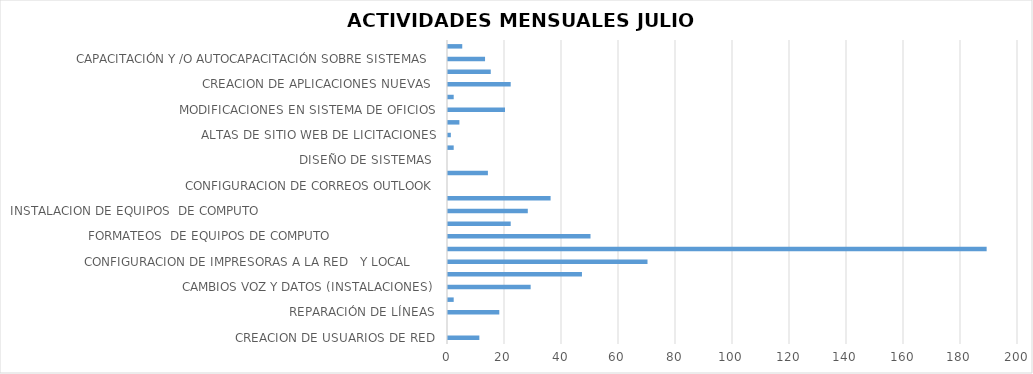
| Category | Series 0 |
|---|---|
| CREACION DE USUARIOS DE RED | 11 |
| CREACION DE CLAVES PARA LLAMADAS A CELULAR  | 0 |
| REPARACIÓN DE LÍNEAS | 18 |
| DICTAMENES DE EQUIPOS (TELEFONOS Y FAXES) | 2 |
| CAMBIOS VOZ Y DATOS (INSTALACIONES) | 29 |
| DICTAMENES DE EQUIPOS DE COMPUTO                             | 47 |
| CONFIGURACION DE IMPRESORAS A LA RED   Y LOCAL       | 70 |
| REVISION DE EQUIPOS DE COMPUTO             | 189 |
| FORMATEOS  DE EQUIPOS DE COMPUTO                            | 50 |
| MANTENIMIENTO DE EQUIPOS  DE COMPUTO               | 22 |
| INSTALACION DE EQUIPOS  DE COMPUTO                                               | 28 |
| INSTALACION DE SOFTWARE EN EQUIPOS DE COMPUTO | 36 |
| CONFIGURACION DE CORREOS OUTLOOK | 0 |
| REPARACIÓN DE EQUIPOS DE CÓMPUTO | 14 |
| DISEÑO DE SISTEMAS  | 0 |
| CREACIÓN DE USUARIOS DE OFICIOS Y CORREOS ELECTRONICOS | 2 |
| ALTAS DE SITIO WEB DE LICITACIONES | 1 |
| SISTEMA EN DESARROLLO | 4 |
| MODIFICACIONES EN SISTEMA DE OFICIOS | 20 |
| MODIFICACION EN SITIO WEB | 2 |
| CREACION DE APLICACIONES NUEVAS  | 22 |
| MANTENIMIENTO DE SISTEMAS  | 15 |
| CAPACITACIÓN Y /O AUTOCAPACITACIÓN SOBRE SISTEMAS  | 13 |
| RESPALDO DE INFORMACIÓN DE BASE DE DATOS  | 5 |